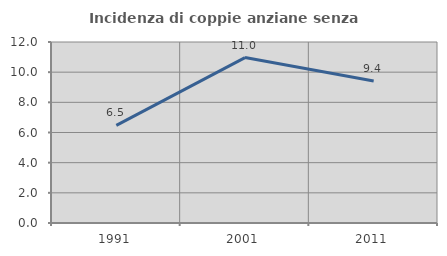
| Category | Incidenza di coppie anziane senza figli  |
|---|---|
| 1991.0 | 6.47 |
| 2001.0 | 10.969 |
| 2011.0 | 9.415 |